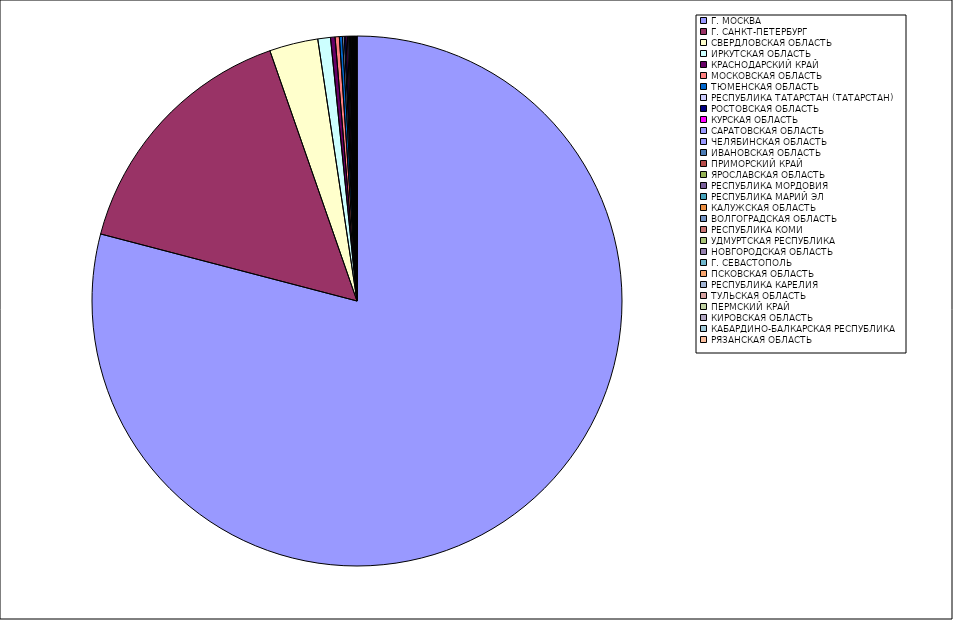
| Category | Оборот |
|---|---|
| Г. МОСКВА | 79.023 |
| Г. САНКТ-ПЕТЕРБУРГ | 15.59 |
| СВЕРДЛОВСКАЯ ОБЛАСТЬ | 2.96 |
| ИРКУТСКАЯ ОБЛАСТЬ | 0.771 |
| КРАСНОДАРСКИЙ КРАЙ | 0.278 |
| МОСКОВСКАЯ ОБЛАСТЬ | 0.256 |
| ТЮМЕНСКАЯ ОБЛАСТЬ | 0.189 |
| РЕСПУБЛИКА ТАТАРСТАН (ТАТАРСТАН) | 0.106 |
| РОСТОВСКАЯ ОБЛАСТЬ | 0.102 |
| КУРСКАЯ ОБЛАСТЬ | 0.086 |
| САРАТОВСКАЯ ОБЛАСТЬ | 0.077 |
| ЧЕЛЯБИНСКАЯ ОБЛАСТЬ | 0.054 |
| ИВАНОВСКАЯ ОБЛАСТЬ | 0.049 |
| ПРИМОРСКИЙ КРАЙ | 0.049 |
| ЯРОСЛАВСКАЯ ОБЛАСТЬ | 0.041 |
| РЕСПУБЛИКА МОРДОВИЯ | 0.034 |
| РЕСПУБЛИКА МАРИЙ ЭЛ | 0.033 |
| КАЛУЖСКАЯ ОБЛАСТЬ | 0.028 |
| ВОЛГОГРАДСКАЯ ОБЛАСТЬ | 0.027 |
| РЕСПУБЛИКА КОМИ | 0.023 |
| УДМУРТСКАЯ РЕСПУБЛИКА | 0.022 |
| НОВГОРОДСКАЯ ОБЛАСТЬ | 0.022 |
| Г. СЕВАСТОПОЛЬ | 0.02 |
| ПСКОВСКАЯ ОБЛАСТЬ | 0.017 |
| РЕСПУБЛИКА КАРЕЛИЯ | 0.016 |
| ТУЛЬСКАЯ ОБЛАСТЬ | 0.015 |
| ПЕРМСКИЙ КРАЙ | 0.015 |
| КИРОВСКАЯ ОБЛАСТЬ | 0.013 |
| КАБАРДИНО-БАЛКАРСКАЯ РЕСПУБЛИКА | 0.012 |
| РЯЗАНСКАЯ ОБЛАСТЬ | 0.012 |